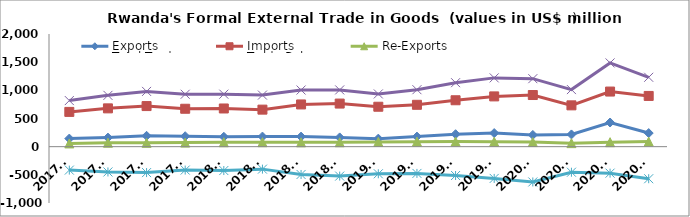
| Category | Exports | Imports | Re-Exports | Total Trade | Trade Balance |
|---|---|---|---|---|---|
| 2017Q1 | 143.779 | 617.137 | 57.385 | 818.301 | -415.973 |
| 2017Q2 | 160.976 | 680 | 69.949 | 910.924 | -449.075 |
| 2017Q3 | 192.623 | 720.694 | 67.884 | 981.201 | -460.187 |
| 2017Q4 | 185.371 | 673.017 | 72.13 | 930.518 | -415.516 |
| 2018Q1 | 175.503 | 677.937 | 78.615 | 932.055 | -423.82 |
| 2018Q2 | 179.292 | 657.371 | 79.24 | 915.902 | -398.839 |
| 2018Q3 | 178.647 | 749.538 | 77.259 | 1005.444 | -493.632 |
| 2018Q4 | 164.227 | 764.887 | 78.312 | 1007.426 | -522.348 |
| 2019Q1 | 142.467 | 708.669 | 84.663 | 935.8 | -481.539 |
| 2019Q2 | 179.031 | 743.119 | 89.245 | 1011.395 | -474.843 |
| 2019Q3 | 221.379 | 823.945 | 90.655 | 1135.979 | -511.911 |
| 2019Q4 | 241.36 | 892.376 | 87.333 | 1221.068 | -563.683 |
| 2020Q1 | 207.953 | 916.682 | 82.251 | 1206.886 | -626.478 |
| 2020Q2 | 217.212 | 733.499 | 62.646 | 1013.356 | -453.641 |
| 2020Q3 | 428.776 | 978.312 | 79.358 | 1486.446 | -470.177 |
| 2020Q4 | 241.35 | 900.354 | 89.908 | 1231.612 | -569.097 |